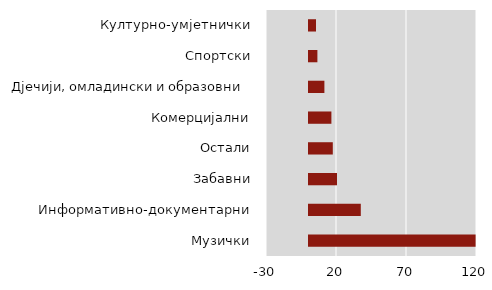
| Category | Series 0 |
|---|---|
| Музички | 119 |
| Информативно-документарни | 37 |
| Забавни | 20 |
| Остали | 17 |
| Комерцијални | 16 |
| Дјечији, омладински и образовни  | 11 |
| Спортски | 6 |
| Културно-умјетнички | 5 |